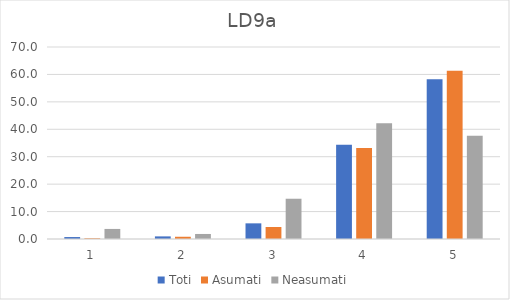
| Category | Toti | Asumati | Neasumati |
|---|---|---|---|
| 0 | 0.713 | 0.273 | 3.67 |
| 1 | 0.951 | 0.82 | 1.835 |
| 2 | 5.707 | 4.372 | 14.679 |
| 3 | 34.364 | 33.197 | 42.202 |
| 4 | 58.264 | 61.339 | 37.615 |